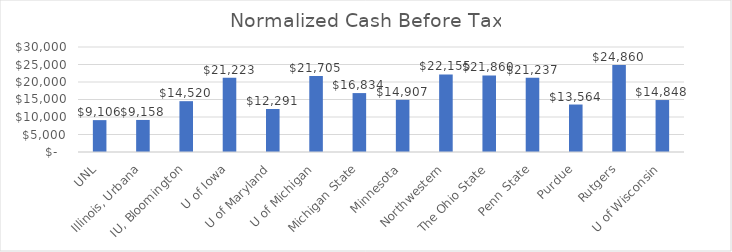
| Category | Series 0 |
|---|---|
| UNL | 9105.886 |
| Illinois, Urbana | 9157.61 |
| IU, Bloomington | 14520.476 |
| U of Iowa | 21222.75 |
| U of Maryland | 12290.918 |
| U of Michigan | 21704.729 |
| Michigan State | 16833.999 |
| Minnesota | 14906.703 |
| Northwestern | 22155.011 |
| The Ohio State | 21859.697 |
| Penn State | 21237.177 |
| Purdue | 13564.15 |
| Rutgers | 24859.88 |
| U of Wisconsin | 14847.655 |